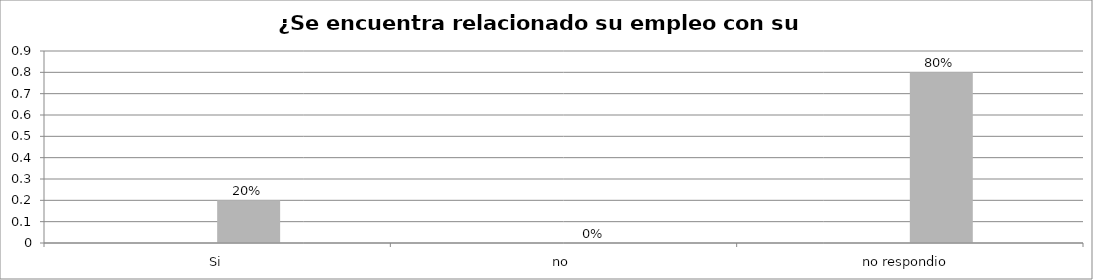
| Category | Series 0 | Series 1 | Series 2 | Series 3 |
|---|---|---|---|---|
| Si |  |  | 0.2 |  |
| no  |  |  | 0 |  |
| no respondio  |  |  | 0.8 |  |